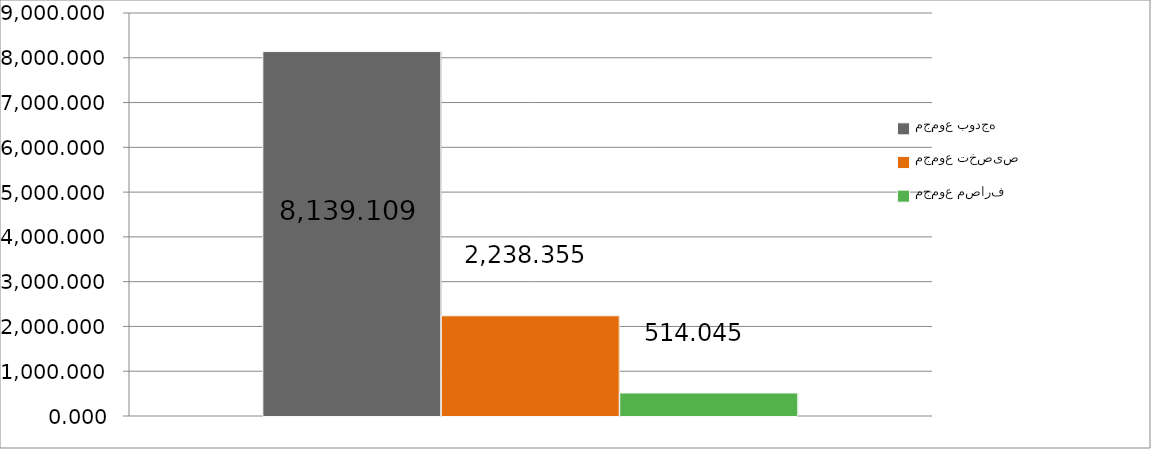
| Category | مجموع بودجه  | مجموع تخصیص | مجموع مصارف |
|---|---|---|---|
| 0 | 8139.109 | 2238.355 | 514.045 |